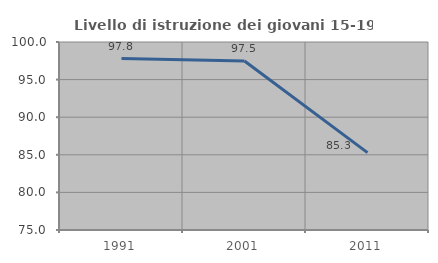
| Category | Livello di istruzione dei giovani 15-19 anni |
|---|---|
| 1991.0 | 97.802 |
| 2001.0 | 97.468 |
| 2011.0 | 85.294 |